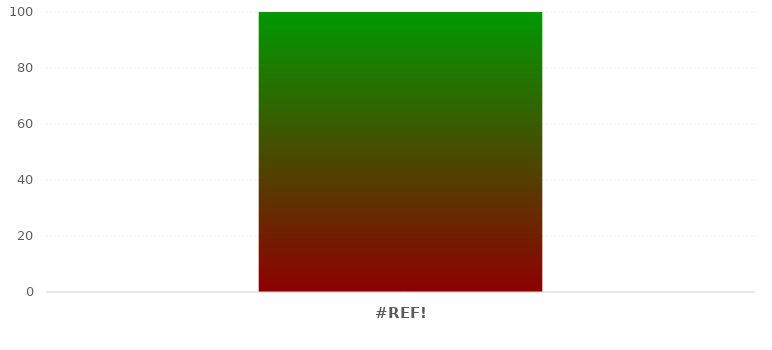
| Category | Niveles |
|---|---|
| 0.0 | 100 |